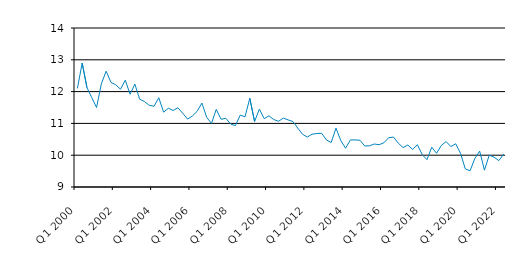
| Category | Series 0 |
|---|---|
| Q1 2000 | 12.1 |
| Q2 2000 | 12.899 |
| Q3 2000 | 12.125 |
| Q4 2000 | 11.812 |
| Q1 2001 | 11.5 |
| Q2 2001 | 12.241 |
| Q3 2001 | 12.642 |
| Q4 2001 | 12.291 |
| Q1 2002 | 12.215 |
| Q2 2002 | 12.075 |
| Q3 2002 | 12.36 |
| Q4 2002 | 11.917 |
| Q1 2003 | 12.236 |
| Q2 2003 | 11.761 |
| Q3 2003 | 11.688 |
| Q4 2003 | 11.569 |
| Q1 2004 | 11.539 |
| Q2 2004 | 11.807 |
| Q3 2004 | 11.354 |
| Q4 2004 | 11.477 |
| Q1 2005 | 11.406 |
| Q2 2005 | 11.493 |
| Q3 2005 | 11.318 |
| Q4 2005 | 11.136 |
| Q1 2006 | 11.231 |
| Q2 2006 | 11.38 |
| Q3 2006 | 11.64 |
| Q4 2006 | 11.19 |
| Q1 2007 | 11 |
| Q2 2007 | 11.44 |
| Q3 2007 | 11.13 |
| Q4 2007 | 11.16 |
| Q1 2008 | 10.98 |
| Q2 2008 | 10.93 |
| Q3 2008 | 11.26 |
| Q4 2008 | 11.21 |
| Q1 2009 | 11.79 |
| Q2 2009 | 11.06 |
| Q3 2009 | 11.45 |
| Q4 2009 | 11.15 |
| Q1 2010 | 11.24 |
| Q2 2010 | 11.12 |
| Q3 2010 | 11.067 |
| Q4 2010 | 11.166 |
| Q1 2011 | 11.11 |
| Q2 2011 | 11.06 |
| Q3 2011 | 10.855 |
| Q4 2011 | 10.66 |
| Q1 2012 | 10.57 |
| Q2 2012 | 10.66 |
| Q3 2012 | 10.68 |
| Q4 2012 | 10.69 |
| Q1 2013 | 10.48 |
| Q2 2013 | 10.4 |
| Q3 2013 | 10.85 |
| Q4 2013 | 10.46 |
| Q1 2014 | 10.22 |
| Q2 2014 | 10.479 |
| Q3 2014 | 10.48 |
| Q4 2014 | 10.47 |
| Q1 2015 | 10.29 |
| Q2 2015 | 10.295 |
| Q3 2015 | 10.352 |
| Q4 2015 | 10.33 |
| Q1 2016 | 10.39 |
| Q2 2016 | 10.55 |
| Q3 2016 | 10.57 |
| Q4 2016 | 10.38 |
| Q1 2017 | 10.24 |
| Q2 2017 | 10.32 |
| Q3 2017 | 10.18 |
| Q4 2017 | 10.33 |
| Q1 2018 | 10.02 |
| Q2 2018 | 9.86 |
| Q3 2018 | 10.251 |
| Q4 2018 | 10.06 |
| Q1 2019 | 10.308 |
| Q2 2019 | 10.429 |
| Q3 2019 | 10.27 |
| Q4 2019 | 10.36 |
| Q1 2020 | 10.06 |
| Q2 2020 | 9.57 |
| Q3 2020 | 9.51 |
| Q4 2020 | 9.9 |
| Q1 2021 | 10.128 |
| Q2 2021 | 9.53 |
| Q3 2021 | 10 |
| Q4 2021 | 9.94 |
| Q1 2022 | 9.83 |
| Q2 2022 | 10.03 |